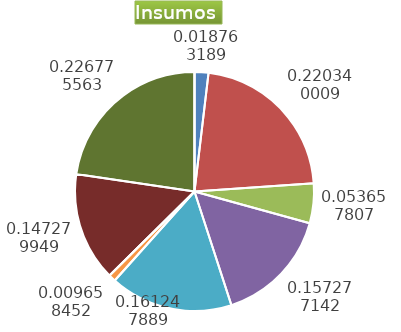
| Category | Series 0 |
|---|---|
| Control arvenses | 1962000 |
| Control fitosanitario | 23040172 |
| Cosecha y beneficio | 5610806.247 |
| Fertilización | 16445912 |
| Instalación | 17383951.117 |
| Otros | 1009950 |
| Podas | 0 |
| Riego | 15400541 |
| Transporte | 23713115 |
| Tutorado | 0 |